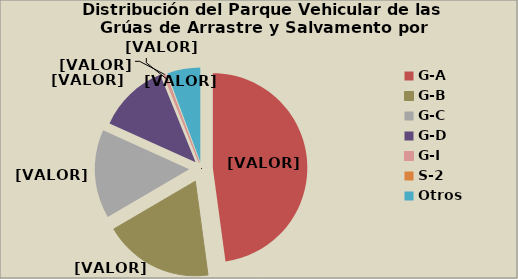
| Category | Series 0 |
|---|---|
| G-A | 47.854 |
| G-B | 18.707 |
| G-C | 15.2 |
| G-D | 12.114 |
| G-I | 0.325 |
| S-2 | 0.095 |
| S-3 | 0.024 |
| Otros | 5.68 |